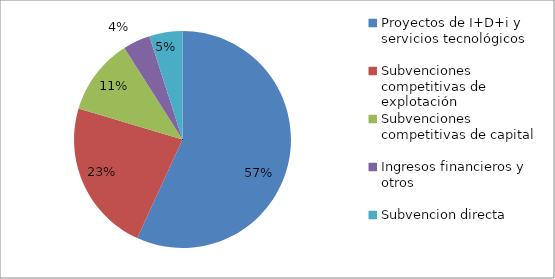
| Category | 2017 |
|---|---|
| Proyectos de I+D+i y servicios tecnológicos | 2361382 |
| Subvenciones competitivas de explotación | 945225 |
| Subvenciones competitivas de capital | 473133.3 |
| Ingresos financieros y otros | 168560 |
| Subvencion directa | 205169.78 |